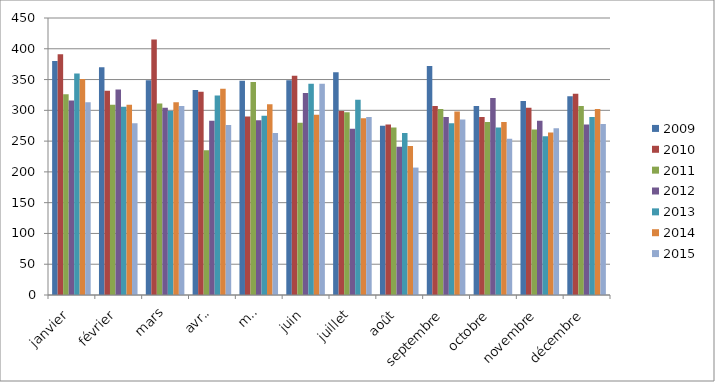
| Category | 2009 | 2010 | 2011 | 2012 | 2013 | 2014 | 2015 |
|---|---|---|---|---|---|---|---|
| janvier | 380 | 391 | 326 | 316 | 360 | 351 | 313 |
| février | 370 | 332 | 309 | 334 | 306 | 309 | 279 |
| mars | 349 | 415 | 311 | 304 | 299 | 313 | 307 |
| avril | 333 | 330 | 235 | 283 | 324 | 335 | 276 |
| mai | 348 | 290 | 346 | 284 | 291 | 310 | 263 |
| juin | 349 | 356 | 280 | 328 | 343 | 293 | 343 |
| juillet | 362 | 299 | 297 | 270 | 317 | 287 | 289 |
| août | 275 | 277 | 272 | 241 | 263 | 242 | 207 |
| septembre | 372 | 307 | 302 | 289 | 279 | 298 | 285 |
| octobre | 307 | 289 | 281 | 320 | 272 | 281 | 254 |
| novembre | 315 | 304 | 269 | 283 | 258 | 264 | 271 |
| décembre | 323 | 327 | 307 | 277 | 289 | 302 | 278 |